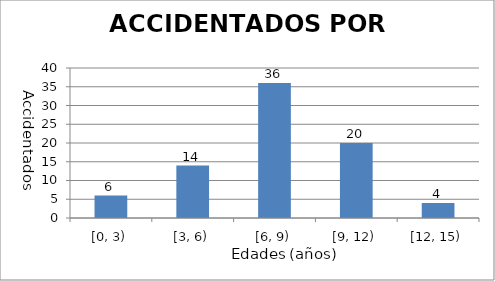
| Category | ACCIDENTADOS POR EDADES |
|---|---|
| [0, 3) | 6 |
| [3, 6) | 14 |
| [6, 9) | 36 |
| [9, 12) | 20 |
| [12, 15) | 4 |